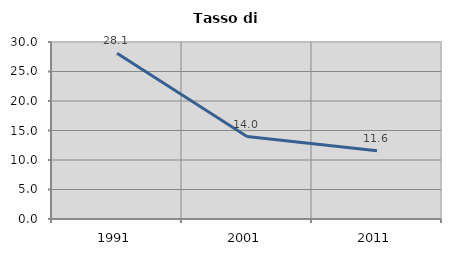
| Category | Tasso di disoccupazione   |
|---|---|
| 1991.0 | 28.108 |
| 2001.0 | 13.978 |
| 2011.0 | 11.558 |